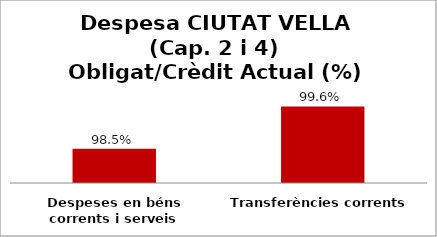
| Category | Series 0 |
|---|---|
| Despeses en béns corrents i serveis | 0.985 |
| Transferències corrents | 0.996 |